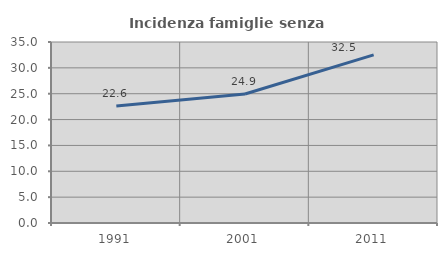
| Category | Incidenza famiglie senza nuclei |
|---|---|
| 1991.0 | 22.612 |
| 2001.0 | 24.947 |
| 2011.0 | 32.52 |